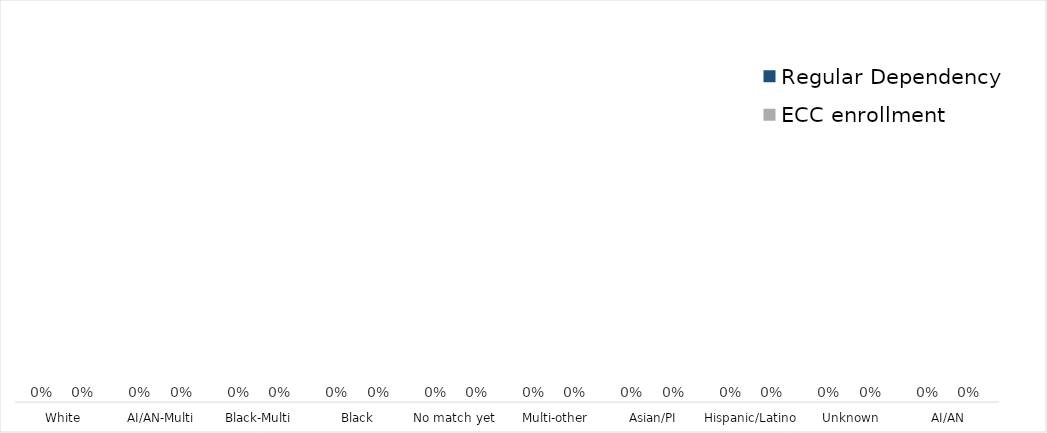
| Category | Regular Dependency | ECC enrollment |
|---|---|---|
| White | 0 | 0 |
| AI/AN-Multi | 0 | 0 |
| Black-Multi | 0 | 0 |
| Black | 0 | 0 |
| No match yet  | 0 | 0 |
| Multi-other | 0 | 0 |
| Asian/PI | 0 | 0 |
| Hispanic/Latino | 0 | 0 |
| Unknown | 0 | 0 |
| AI/AN | 0 | 0 |